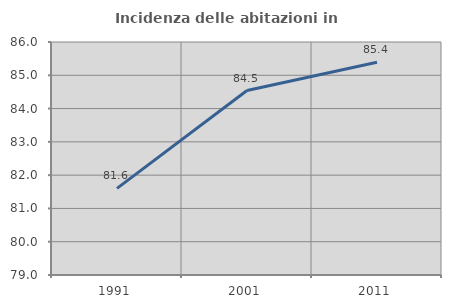
| Category | Incidenza delle abitazioni in proprietà  |
|---|---|
| 1991.0 | 81.603 |
| 2001.0 | 84.542 |
| 2011.0 | 85.392 |